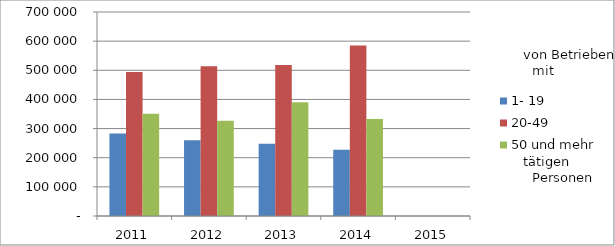
| Category | 1- 19 | 20-49 | 50 und mehr |
|---|---|---|---|
| 2011.0 | 282970.054 | 494391.89 | 350639.642 |
| 2012.0 | 259910.785 | 514143.634 | 327082.591 |
| 2013.0 | 247934.383 | 518337.491 | 390032.948 |
| 2014.0 | 227132.521 | 584877.621 | 332909.543 |
| 2015.0 | 0 | 0 | 0 |